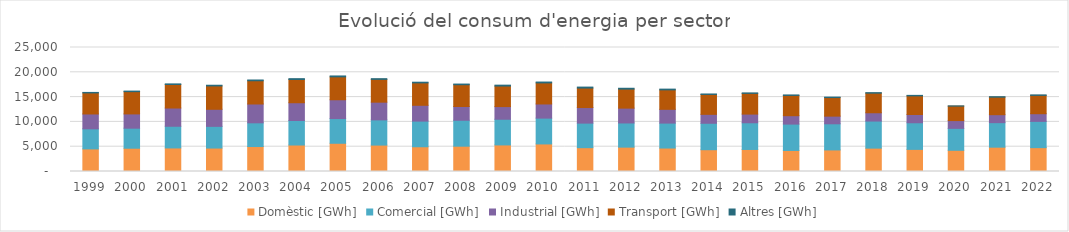
| Category | Domèstic [GWh] | Comercial [GWh] | Industrial [GWh] | Transport [GWh] | Altres [GWh] |
|---|---|---|---|---|---|
| 1999.0 | 4556.036 | 4049.601 | 2993.501 | 4244.246 | 99.757 |
| 2000.0 | 4692.315 | 4038.57 | 2878.736 | 4486.774 | 114.989 |
| 2001.0 | 4750.339 | 4368.862 | 3679.772 | 4739.312 | 124.831 |
| 2002.0 | 4727.675 | 4372.353 | 3442.84 | 4707.584 | 140.415 |
| 2003.0 | 5033.801 | 4779.74 | 3796.527 | 4683.433 | 155 |
| 2004.0 | 5340.752 | 4945.835 | 3576.704 | 4679.589 | 176.14 |
| 2005.0 | 5690.06 | 4981.522 | 3790.391 | 4620.078 | 181.25 |
| 2006.0 | 5325.526 | 5081.15 | 3570.532 | 4591.782 | 146.23 |
| 2007.0 | 4987.946 | 5170.455 | 3189.404 | 4517.58 | 137.56 |
| 2008.0 | 5102.061 | 5230.194 | 2774.59 | 4384.721 | 138.06 |
| 2009.0 | 5357.999 | 5179.352 | 2548.577 | 4142.221 | 179.771 |
| 2010.0 | 5557.847 | 5201.385 | 2856.292 | 4247.971 | 173.381 |
| 2011.0 | 4803.802 | 4949.985 | 3140.077 | 3927.507 | 197.258 |
| 2012.0 | 4912.908 | 4874.178 | 2989.518 | 3832.877 | 172.531 |
| 2013.0 | 4730.525 | 5026.401 | 2780.129 | 3918.035 | 154.092 |
| 2014.0 | 4393.404 | 5327.08 | 1803.583 | 4008.089 | 95.409 |
| 2015.0 | 4442.383 | 5379.924 | 1752.545 | 4169.555 | 97.451 |
| 2016.0 | 4242.862 | 5312.62 | 1694.759 | 4082.421 | 101.075 |
| 2017.0 | 4348.541 | 5270.542 | 1542.259 | 3744.945 | 89.02 |
| 2018.0 | 4711.418 | 5456.23 | 1675.289 | 3950.475 | 102.81 |
| 2019.0 | 4458.496 | 5367.396 | 1668.264 | 3752.165 | 100.621 |
| 2020.0 | 4276.784 | 4419.067 | 1571.041 | 2917.198 | 37.998 |
| 2021.0 | 4905.1 | 4942.97 | 1605.55 | 3533.38 | 91.1 |
| 2022.0 | 4810.98 | 5294.76 | 1545.68 | 3692.22 | 98.93 |